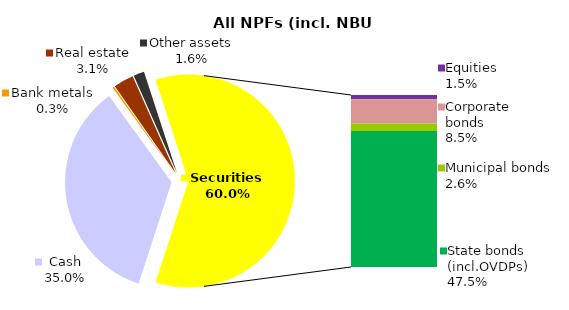
| Category | All NPF (incl. NBU CNPF)* |
|---|---|
| Cash | 1326.223 |
| Bank metals | 10.307 |
| Real estate | 116.085 |
| Other assets | 61.831 |
| Equities | 56.426 |
| Corporate bonds | 321.368 |
| Municipal bonds | 96.616 |
| State bonds (incl.OVDPs) | 1799.324 |